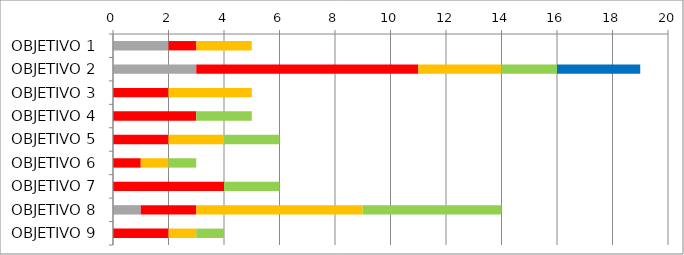
| Category | Series 1 | Series 2 | Series 3 | Series 4 | Series 5 |
|---|---|---|---|---|---|
| OBJETIVO 1 | 2 | 1 | 2 | 0 | 0 |
| OBJETIVO 2 | 3 | 8 | 3 | 2 | 3 |
| OBJETIVO 3 | 0 | 2 | 3 | 0 | 0 |
| OBJETIVO 4 | 0 | 3 | 0 | 2 | 0 |
| OBJETIVO 5 | 0 | 2 | 2 | 2 | 0 |
| OBJETIVO 6 | 0 | 1 | 1 | 1 | 0 |
| OBJETIVO 7 | 0 | 4 | 0 | 2 | 0 |
| OBJETIVO 8 | 1 | 2 | 6 | 5 | 0 |
| OBJETIVO 9 | 0 | 2 | 1 | 1 | 0 |